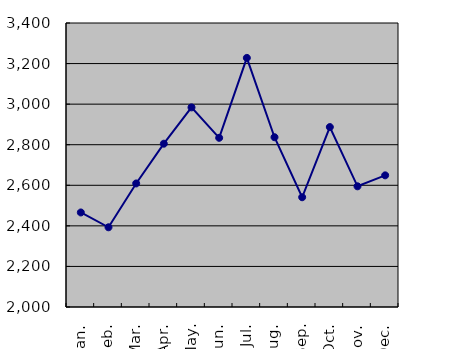
| Category | Series 0 |
|---|---|
| Jan. | 2466 |
| Feb. | 2393 |
| Mar. | 2609 |
| Apr. | 2805 |
| May. | 2984 |
| Jun. | 2834 |
| Jul. | 3228 |
| Aug. | 2837 |
| Sep. | 2541 |
| Oct. | 2887 |
| Nov. | 2595 |
| Dec. | 2649 |